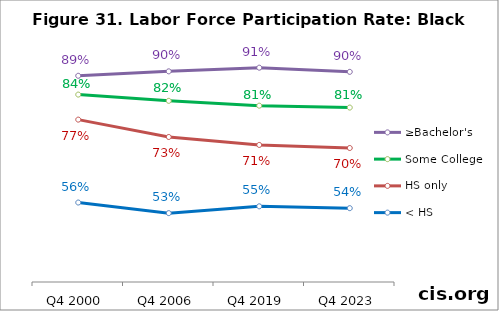
| Category | ≥Bachelor's | Some College | HS only | < HS |
|---|---|---|---|---|
| Q4 2000 | 0.888 | 0.839 | 0.774 | 0.557 |
| Q4 2006 | 0.9 | 0.823 | 0.728 | 0.53 |
| Q4 2019 | 0.909 | 0.81 | 0.708 | 0.547 |
| Q4 2023 | 0.898 | 0.805 | 0.7 | 0.543 |